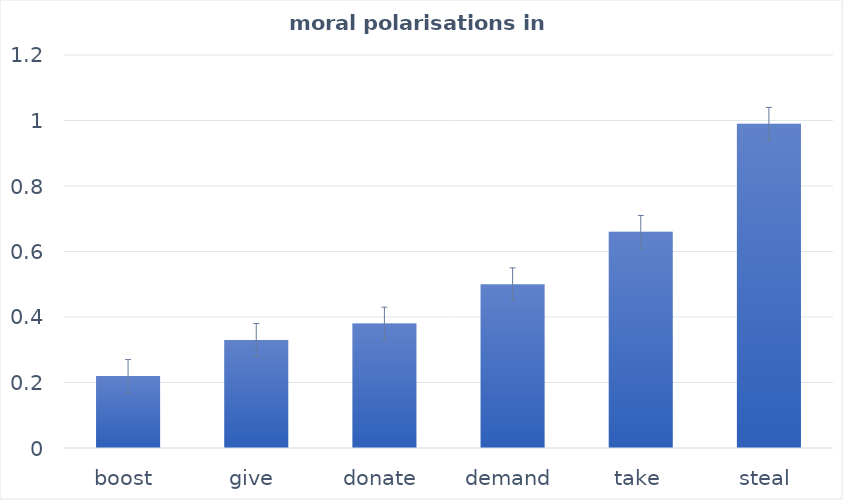
| Category | Series 0 |
|---|---|
| boost | 0.22 |
| give | 0.33 |
| donate | 0.38 |
| demand | 0.5 |
| take | 0.66 |
| steal | 0.99 |